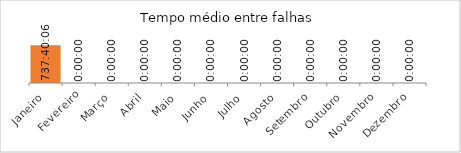
| Category | Tempo médio entre falhas |
|---|---|
| Janeiro | 1900-01-30 17:40:06 |
| Fevereiro | 0 |
| Março | 0 |
| Abril | 0 |
| Maio | 0 |
| Junho | 0 |
| Julho | 0 |
| Agosto | 0 |
| Setembro | 0 |
| Outubro | 0 |
| Novembro | 0 |
| Dezembro | 0 |